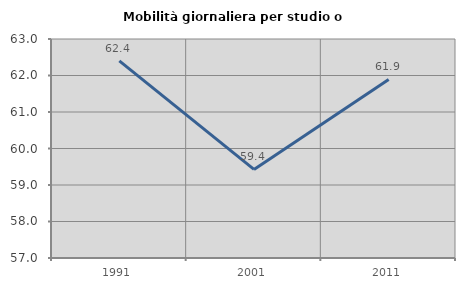
| Category | Mobilità giornaliera per studio o lavoro |
|---|---|
| 1991.0 | 62.4 |
| 2001.0 | 59.426 |
| 2011.0 | 61.893 |